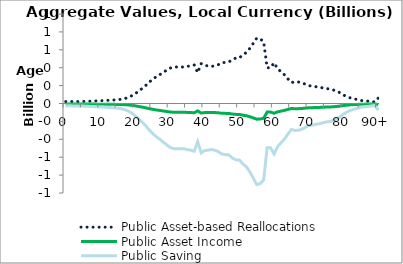
| Category | Public Asset-based Reallocations | Public Asset Income | Public Saving |
|---|---|---|---|
| 0 | 21.534 | -5.166 | -26.7 |
|  | 21.251 | -5.098 | -26.349 |
| 2 | 21.518 | -5.162 | -26.681 |
| 3 | 21.71 | -5.208 | -26.918 |
| 4 | 22.199 | -5.326 | -27.524 |
| 5 | 23.006 | -5.519 | -28.526 |
| 6 | 24.775 | -5.944 | -30.719 |
| 7 | 26.313 | -6.313 | -32.626 |
| 8 | 27.889 | -6.691 | -34.58 |
| 9 | 29.864 | -7.164 | -37.028 |
| 10 | 31.403 | -7.534 | -38.937 |
| 11 | 32.576 | -7.815 | -40.392 |
| 12 | 34.959 | -8.387 | -43.346 |
| 13 | 36.949 | -8.864 | -45.813 |
| 14 | 39.973 | -9.59 | -49.563 |
| 15 | 43.158 | -10.354 | -53.512 |
| 16 | 47.27 | -11.34 | -58.61 |
| 17 | 54.989 | -13.192 | -68.181 |
| 18 | 67.769 | -16.258 | -84.027 |
| 19 | 86.2 | -20.68 | -106.88 |
| 20 | 109.923 | -26.371 | -136.294 |
| 21 | 139.126 | -33.377 | -172.503 |
| 22 | 167.556 | -40.198 | -207.754 |
| 23 | 199.322 | -47.818 | -247.14 |
| 24 | 238.115 | -57.125 | -295.24 |
| 25 | 268.229 | -64.349 | -332.578 |
| 26 | 298.25 | -71.552 | -369.802 |
| 27 | 319.861 | -76.736 | -396.598 |
| 28 | 345.83 | -82.966 | -428.796 |
| 29 | 370.123 | -88.794 | -458.918 |
| 30 | 395.143 | -94.797 | -489.94 |
| 31 | 406.623 | -97.551 | -504.174 |
| 32 | 408.394 | -97.976 | -506.37 |
| 33 | 408.625 | -98.031 | -506.657 |
| 34 | 406.781 | -97.589 | -504.37 |
| 35 | 415.903 | -99.777 | -515.68 |
| 36 | 420.587 | -100.901 | -521.488 |
| 37 | 430.308 | -103.233 | -533.541 |
| 38 | 344.214 | -82.579 | -426.793 |
| 39 | 444.85 | -106.722 | -551.571 |
| 40 | 424.065 | -101.735 | -525.8 |
| 41 | 420.801 | -100.952 | -521.753 |
| 42 | 414.319 | -99.397 | -513.717 |
| 43 | 421.97 | -101.233 | -523.203 |
| 44 | 434.982 | -104.354 | -539.336 |
| 45 | 456.096 | -109.42 | -565.515 |
| 46 | 459.897 | -110.332 | -570.228 |
| 47 | 464.458 | -111.426 | -575.884 |
| 48 | 491.367 | -117.882 | -609.249 |
| 49 | 507.812 | -121.827 | -629.639 |
| 50 | 509.429 | -122.215 | -631.644 |
| 51 | 544.685 | -130.673 | -675.358 |
| 52 | 569.576 | -136.644 | -706.221 |
| 53 | 615.34 | -147.623 | -762.963 |
| 54 | 671.875 | -161.186 | -833.062 |
| 55 | 729.942 | -175.117 | -905.058 |
| 56 | 722.961 | -173.442 | -896.403 |
| 57 | 687.925 | -165.037 | -852.962 |
| 58 | 399.497 | -95.841 | -495.338 |
| 59 | 399.36 | -95.808 | -495.168 |
| 60 | 454.937 | -109.142 | -564.079 |
| 61 | 388.832 | -93.283 | -482.115 |
| 62 | 354.025 | -84.933 | -438.958 |
| 63 | 320.197 | -76.817 | -397.013 |
| 64 | 274.366 | -65.822 | -340.188 |
| 65 | 233.554 | -56.031 | -289.585 |
| 66 | 243.036 | -58.306 | -301.342 |
| 67 | 240.2 | -57.625 | -297.825 |
| 68 | 232.478 | -55.773 | -288.251 |
| 69 | 215.458 | -51.689 | -267.147 |
| 70 | 199.027 | -47.748 | -246.775 |
| 71 | 194.052 | -46.554 | -240.606 |
| 72 | 187.626 | -45.013 | -232.639 |
| 73 | 182.272 | -43.728 | -225.999 |
| 74 | 174.148 | -41.779 | -215.927 |
| 75 | 166.465 | -39.936 | -206.401 |
| 76 | 162.792 | -39.055 | -201.847 |
| 77 | 152.127 | -36.496 | -188.624 |
| 78 | 136.863 | -32.834 | -169.698 |
| 79 | 120.295 | -28.859 | -149.154 |
| 80 | 94.208 | -22.601 | -116.808 |
| 81 | 76.399 | -18.329 | -94.728 |
| 82 | 61.697 | -14.801 | -76.498 |
| 83 | 51.809 | -12.429 | -64.239 |
| 84 | 44.66 | -10.714 | -55.374 |
| 85 | 33.4 | -8.013 | -41.413 |
| 86 | 29.466 | -7.069 | -36.535 |
| 87 | 26.687 | -6.402 | -33.089 |
| 88 | 21.832 | -5.238 | -27.069 |
| 89 | 17.232 | -4.134 | -21.366 |
| 90+ | 59.834 | -14.355 | -74.189 |